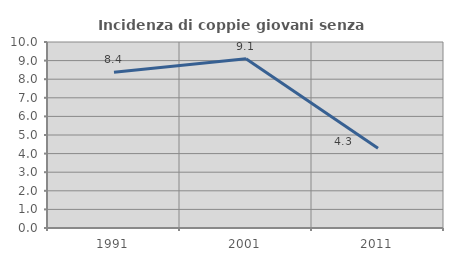
| Category | Incidenza di coppie giovani senza figli |
|---|---|
| 1991.0 | 8.376 |
| 2001.0 | 9.105 |
| 2011.0 | 4.283 |